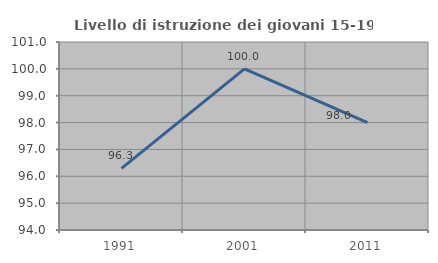
| Category | Livello di istruzione dei giovani 15-19 anni |
|---|---|
| 1991.0 | 96.296 |
| 2001.0 | 100 |
| 2011.0 | 98 |